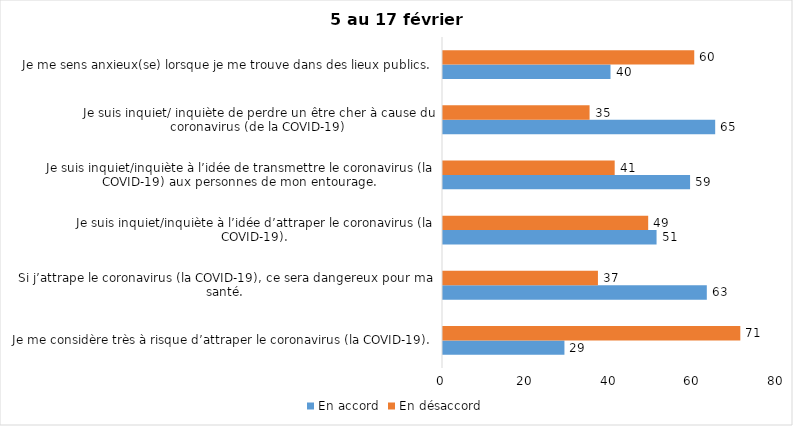
| Category | En accord | En désaccord |
|---|---|---|
| Je me considère très à risque d’attraper le coronavirus (la COVID-19). | 29 | 71 |
| Si j’attrape le coronavirus (la COVID-19), ce sera dangereux pour ma santé. | 63 | 37 |
| Je suis inquiet/inquiète à l’idée d’attraper le coronavirus (la COVID-19). | 51 | 49 |
| Je suis inquiet/inquiète à l’idée de transmettre le coronavirus (la COVID-19) aux personnes de mon entourage. | 59 | 41 |
| Je suis inquiet/ inquiète de perdre un être cher à cause du coronavirus (de la COVID-19) | 65 | 35 |
| Je me sens anxieux(se) lorsque je me trouve dans des lieux publics. | 40 | 60 |